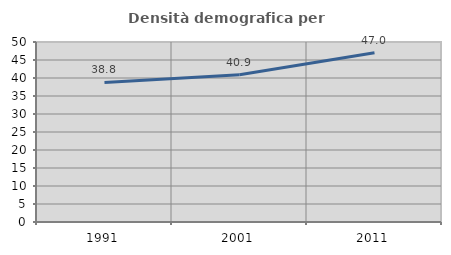
| Category | Densità demografica |
|---|---|
| 1991.0 | 38.774 |
| 2001.0 | 40.911 |
| 2011.0 | 47.032 |